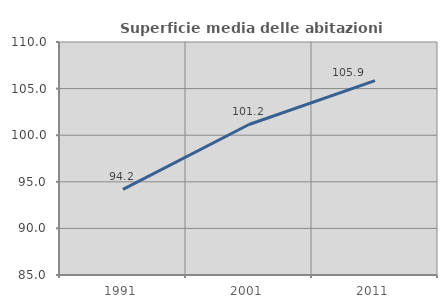
| Category | Superficie media delle abitazioni occupate |
|---|---|
| 1991.0 | 94.188 |
| 2001.0 | 101.151 |
| 2011.0 | 105.853 |